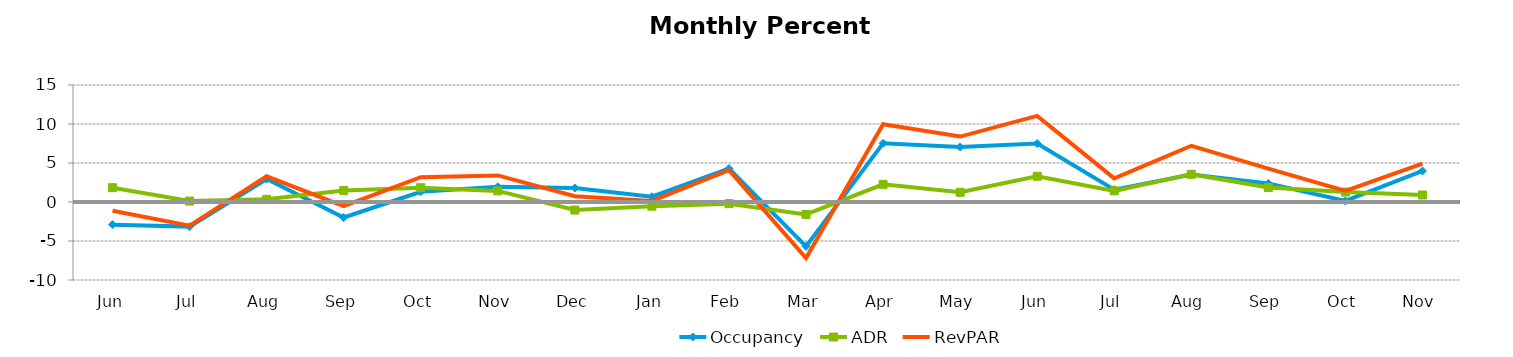
| Category | Occupancy | ADR | RevPAR |
|---|---|---|---|
| Jun | -2.903 | 1.838 | -1.119 |
| Jul | -3.155 | 0.118 | -3.041 |
| Aug | 2.941 | 0.342 | 3.292 |
| Sep | -1.986 | 1.483 | -0.532 |
| Oct | 1.316 | 1.834 | 3.174 |
| Nov | 1.955 | 1.426 | 3.409 |
| Dec | 1.793 | -1.03 | 0.745 |
| Jan | 0.678 | -0.535 | 0.14 |
| Feb | 4.296 | -0.212 | 4.076 |
| Mar | -5.685 | -1.595 | -7.189 |
| Apr | 7.522 | 2.267 | 9.96 |
| May | 7.055 | 1.247 | 8.39 |
| Jun | 7.497 | 3.297 | 11.04 |
| Jul | 1.58 | 1.431 | 3.033 |
| Aug | 3.531 | 3.554 | 7.211 |
| Sep | 2.38 | 1.852 | 4.277 |
| Oct | 0.135 | 1.274 | 1.411 |
| Nov | 3.977 | 0.899 | 4.913 |